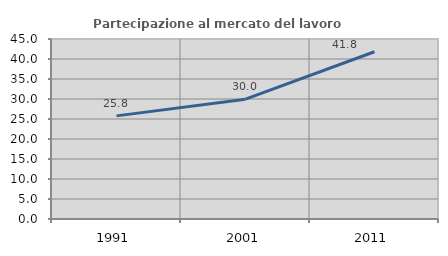
| Category | Partecipazione al mercato del lavoro  femminile |
|---|---|
| 1991.0 | 25.781 |
| 2001.0 | 29.958 |
| 2011.0 | 41.818 |